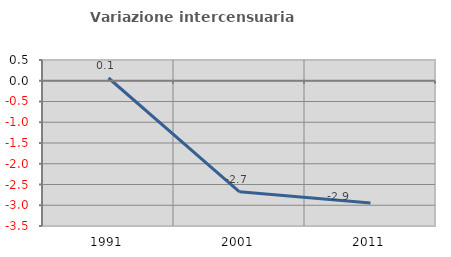
| Category | Variazione intercensuaria annua |
|---|---|
| 1991.0 | 0.066 |
| 2001.0 | -2.677 |
| 2011.0 | -2.946 |